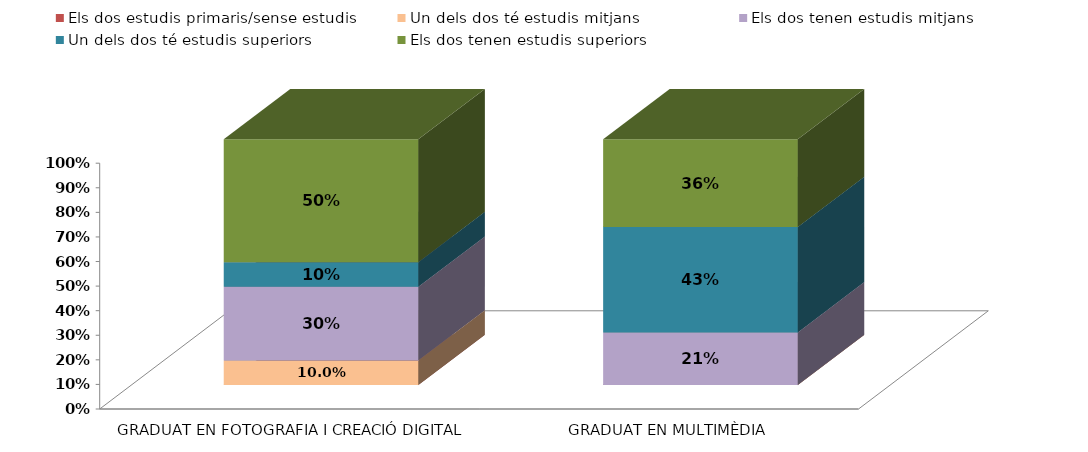
| Category | Els dos estudis primaris/sense estudis | Un dels dos té estudis mitjans | Els dos tenen estudis mitjans | Un dels dos té estudis superiors | Els dos tenen estudis superiors |
|---|---|---|---|---|---|
| GRADUAT EN FOTOGRAFIA I CREACIÓ DIGITAL | 0 | 0.1 | 0.3 | 0.1 | 0.5 |
| GRADUAT EN MULTIMÈDIA | 0 | 0 | 0.214 | 0.429 | 0.357 |